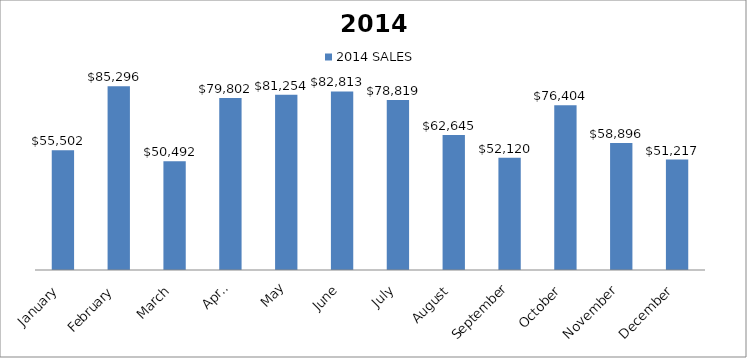
| Category | 2014 SALES |
|---|---|
| January | 55502 |
| February | 85296 |
| March | 50492 |
| April | 79802 |
| May | 81254 |
| June | 82813 |
| July | 78819 |
| August | 62645 |
| September | 52120 |
| October | 76404 |
| November | 58896 |
| December | 51217 |